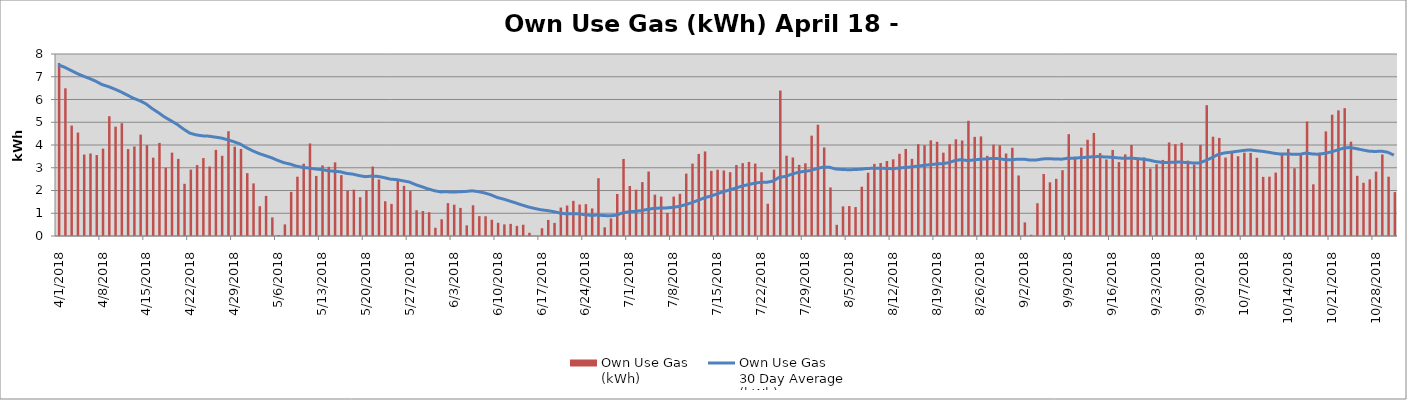
| Category | Own Use Gas
(kWh) |
|---|---|
| 4/1/18 | 7604219 |
| 4/2/18 | 6491744 |
| 4/3/18 | 4853061 |
| 4/4/18 | 4548355 |
| 4/5/18 | 3579529 |
| 4/6/18 | 3626281 |
| 4/7/18 | 3556372 |
| 4/8/18 | 3841883 |
| 4/9/18 | 5265679 |
| 4/10/18 | 4807054 |
| 4/11/18 | 4959534 |
| 4/12/18 | 3821856 |
| 4/13/18 | 3934795 |
| 4/14/18 | 4456419 |
| 4/15/18 | 3995686 |
| 4/16/18 | 3444380 |
| 4/17/18 | 4092522 |
| 4/18/18 | 2999712 |
| 4/19/18 | 3664195 |
| 4/20/18 | 3390440 |
| 4/21/18 | 2295820 |
| 4/22/18 | 2918571 |
| 4/23/18 | 3119473 |
| 4/24/18 | 3425965 |
| 4/25/18 | 3055632 |
| 4/26/18 | 3787600 |
| 4/27/18 | 3525448 |
| 4/28/18 | 4605379 |
| 4/29/18 | 3923695 |
| 4/30/18 | 3827817 |
| 5/1/18 | 2762231 |
| 5/2/18 | 2312007 |
| 5/3/18 | 1310460 |
| 5/4/18 | 1764184 |
| 5/5/18 | 818415 |
| 5/6/18 | 40935 |
| 5/7/18 | 510015 |
| 5/8/18 | 1940158 |
| 5/9/18 | 2606521 |
| 5/10/18 | 3176745 |
| 5/11/18 | 4069107 |
| 5/12/18 | 2640340 |
| 5/13/18 | 3103173 |
| 5/14/18 | 3042330 |
| 5/15/18 | 3236328 |
| 5/16/18 | 2675160 |
| 5/17/18 | 1992898 |
| 5/18/18 | 2037327 |
| 5/19/18 | 1704610 |
| 5/20/18 | 2014479 |
| 5/21/18 | 3053999 |
| 5/22/18 | 2483233 |
| 5/23/18 | 1526994 |
| 5/24/18 | 1411165 |
| 5/25/18 | 2440674 |
| 5/26/18 | 2206250 |
| 5/27/18 | 1974225 |
| 5/28/18 | 1132292 |
| 5/29/18 | 1096446 |
| 5/30/18 | 1046477 |
| 5/31/18 | 361289 |
| 6/1/18 | 736094 |
| 6/2/18 | 1445361 |
| 6/3/18 | 1376812 |
| 6/4/18 | 1236150 |
| 6/5/18 | 468116 |
| 6/6/18 | 1349756 |
| 6/7/18 | 874505 |
| 6/8/18 | 867596 |
| 6/9/18 | 713408 |
| 6/10/18 | 581199 |
| 6/11/18 | 509489 |
| 6/12/18 | 533323 |
| 6/13/18 | 446321 |
| 6/14/18 | 495564 |
| 6/15/18 | 141900 |
| 6/16/18 | 0 |
| 6/17/18 | 341236 |
| 6/18/18 | 706149 |
| 6/19/18 | 576444 |
| 6/20/18 | 1251931 |
| 6/21/18 | 1341003 |
| 6/22/18 | 1545623 |
| 6/23/18 | 1383666 |
| 6/24/18 | 1399827 |
| 6/25/18 | 1211586 |
| 6/26/18 | 2539997 |
| 6/27/18 | 383186 |
| 6/28/18 | 773649 |
| 6/29/18 | 1848006 |
| 6/30/18 | 3387473 |
| 7/1/18 | 2199074 |
| 7/2/18 | 2036537 |
| 7/3/18 | 2368815 |
| 7/4/18 | 2833727 |
| 7/5/18 | 1816616 |
| 7/6/18 | 1733027 |
| 7/7/18 | 1015840 |
| 7/8/18 | 1733887 |
| 7/9/18 | 1854871 |
| 7/10/18 | 2742476 |
| 7/11/18 | 3182385 |
| 7/12/18 | 3609624 |
| 7/13/18 | 3716606 |
| 7/14/18 | 2863848 |
| 7/15/18 | 2913521 |
| 7/16/18 | 2882423 |
| 7/17/18 | 2807698 |
| 7/18/18 | 3119470 |
| 7/19/18 | 3201291 |
| 7/20/18 | 3254406 |
| 7/21/18 | 3182465 |
| 7/22/18 | 2801926 |
| 7/23/18 | 1416890 |
| 7/24/18 | 2918461 |
| 7/25/18 | 6392683 |
| 7/26/18 | 3529647 |
| 7/27/18 | 3450588 |
| 7/28/18 | 3127002 |
| 7/29/18 | 3194970 |
| 7/30/18 | 4410029 |
| 7/31/18 | 4891461 |
| 8/1/18 | 3891495 |
| 8/2/18 | 2135240 |
| 8/3/18 | 491338 |
| 8/4/18 | 1303550 |
| 8/5/18 | 1316972 |
| 8/6/18 | 1272202 |
| 8/7/18 | 2166942 |
| 8/8/18 | 2783573 |
| 8/9/18 | 3168484 |
| 8/10/18 | 3209022 |
| 8/11/18 | 3297647 |
| 8/12/18 | 3371180 |
| 8/13/18 | 3612652 |
| 8/14/18 | 3826515 |
| 8/15/18 | 3390599 |
| 8/16/18 | 4036481 |
| 8/17/18 | 3990651 |
| 8/18/18 | 4205036 |
| 8/19/18 | 4142135 |
| 8/20/18 | 3662849 |
| 8/21/18 | 4036648 |
| 8/22/18 | 4249897 |
| 8/23/18 | 4198969 |
| 8/24/18 | 5063236 |
| 8/25/18 | 4357627 |
| 8/26/18 | 4375991 |
| 8/27/18 | 3524859 |
| 8/28/18 | 4015144 |
| 8/29/18 | 3988317 |
| 8/30/18 | 3625184 |
| 8/31/18 | 3878922 |
| 9/1/18 | 2660335 |
| 9/2/18 | 598104 |
| 9/3/18 | 54057 |
| 9/4/18 | 1441218 |
| 9/5/18 | 2725989 |
| 9/6/18 | 2360739 |
| 9/7/18 | 2513630 |
| 9/8/18 | 2892306 |
| 9/9/18 | 4477611 |
| 9/10/18 | 3420924 |
| 9/11/18 | 3883693 |
| 9/12/18 | 4230060 |
| 9/13/18 | 4530631 |
| 9/14/18 | 3644434 |
| 9/15/18 | 3366628 |
| 9/16/18 | 3782998 |
| 9/17/18 | 3248374 |
| 9/18/18 | 3587421 |
| 9/19/18 | 4001731 |
| 9/20/18 | 3399590 |
| 9/21/18 | 3455766 |
| 9/22/18 | 2964071 |
| 9/23/18 | 3153972 |
| 9/24/18 | 3344561 |
| 9/25/18 | 4110291 |
| 9/26/18 | 4035237 |
| 9/27/18 | 4098998 |
| 9/28/18 | 3313368 |
| 9/29/18 | 3132970 |
| 9/30/18 | 4007726 |
| 10/1/18 | 5750263 |
| 10/2/18 | 4364546 |
| 10/3/18 | 4311293 |
| 10/4/18 | 3447892 |
| 10/5/18 | 3677422 |
| 10/6/18 | 3505811 |
| 10/7/18 | 3663689 |
| 10/8/18 | 3652928 |
| 10/9/18 | 3437332 |
| 10/10/18 | 2600140 |
| 10/11/18 | 2608441 |
| 10/12/18 | 2786392 |
| 10/13/18 | 3561824 |
| 10/14/18 | 3829575 |
| 10/15/18 | 2978901 |
| 10/16/18 | 3635553 |
| 10/17/18 | 5035466 |
| 10/18/18 | 2272109 |
| 10/19/18 | 3662763 |
| 10/20/18 | 4598115 |
| 10/21/18 | 5331330 |
| 10/22/18 | 5521651 |
| 10/23/18 | 5619991 |
| 10/24/18 | 4145277 |
| 10/25/18 | 2645130 |
| 10/26/18 | 2339997 |
| 10/27/18 | 2488493 |
| 10/28/18 | 2830435 |
| 10/29/18 | 3585421 |
| 10/30/18 | 2607225 |
| 10/31/18 | 1930565 |